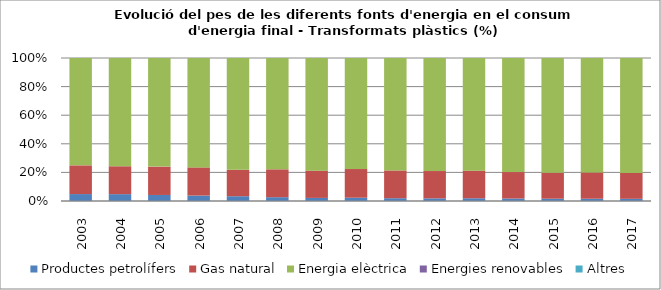
| Category | Productes petrolífers | Gas natural | Energia elèctrica | Energies renovables | Altres |
|---|---|---|---|---|---|
| 2003.0 | 7.6 | 31.5 | 117.8 | 0 | 0 |
| 2004.0 | 7.7 | 31.3 | 121.5 | 0 | 0 |
| 2005.0 | 6.8 | 32 | 122.5 | 0 | 0 |
| 2006.0 | 6.2 | 32.1 | 124.6 | 0 | 0 |
| 2007.0 | 5.4 | 29.9 | 126.2 | 0 | 0 |
| 2008.0 | 3.9 | 28.6 | 114.2 | 0 | 0 |
| 2009.0 | 2.6 | 23 | 95 | 0 | 0 |
| 2010.0 | 3 | 26.2 | 101.4 | 0 | 0 |
| 2011.0 | 2.5 | 25 | 101.2 | 0 | 0 |
| 2012.0 | 2.3 | 23.8 | 98.5 | 0 | 0 |
| 2013.0 | 2.4 | 24.3 | 99.1 | 0 | 0 |
| 2014.0 | 2.2 | 23.6 | 101.9 | 0 | 0 |
| 2015.0 | 2.1 | 23.8 | 105 | 0 | 0 |
| 2016.0 | 2.1 | 24.4 | 106.2 | 0 | 0 |
| 2017.0 | 2.1 | 24.9 | 110.3 | 0 | 0 |